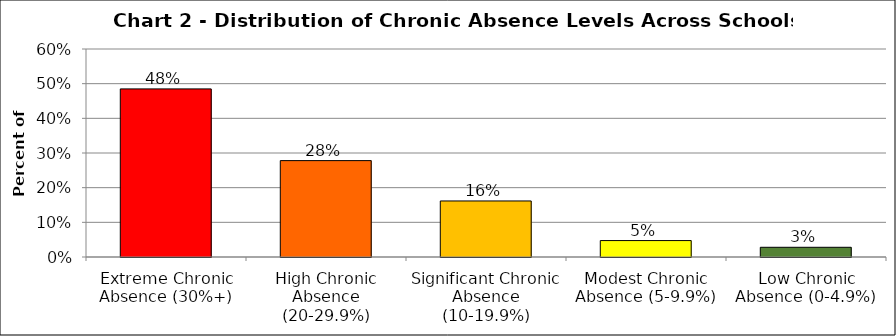
| Category | Series 1 |
|---|---|
| Extreme Chronic Absence (30%+) | 0.485 |
| High Chronic Absence (20-29.9%) | 0.278 |
| Significant Chronic Absence (10-19.9%) | 0.162 |
| Modest Chronic Absence (5-9.9%) | 0.047 |
| Low Chronic Absence (0-4.9%) | 0.028 |